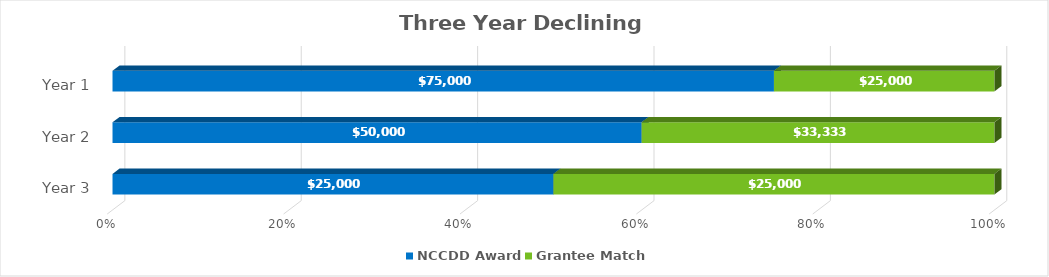
| Category | NCCDD Award | Grantee Match |
|---|---|---|
| Year 3 | 25000 | 25000 |
| Year 2 | 50000 | 33333.333 |
| Year 1 | 75000 | 25000 |